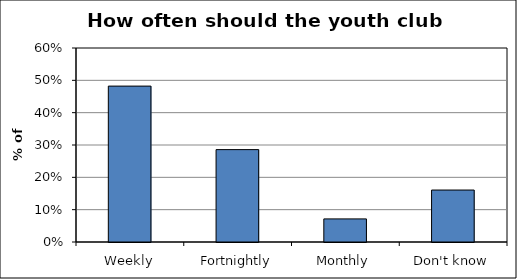
| Category | Series 0 |
|---|---|
| Weekly | 0.482 |
| Fortnightly | 0.286 |
| Monthly | 0.071 |
| Don't know | 0.161 |